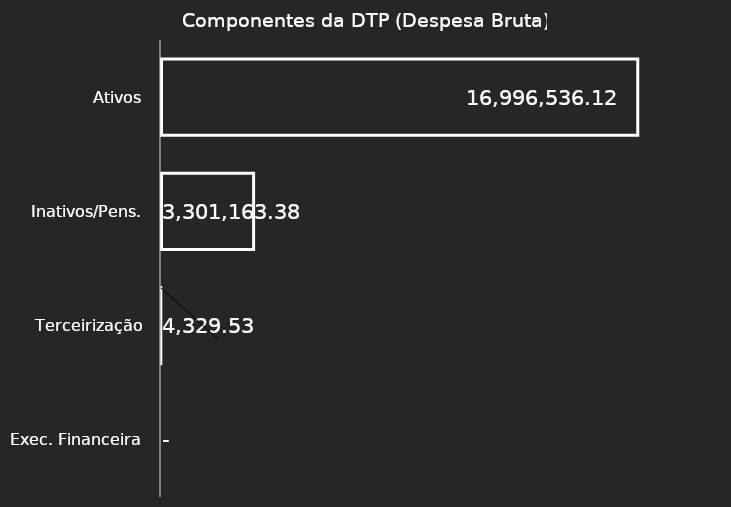
| Category | Valor |
|---|---|
| Ativos | 16996536.12 |
| Inativos/Pens. | 3301163.38 |
| Terceirização | 4329.53 |
| Exec. Financeira | 0 |